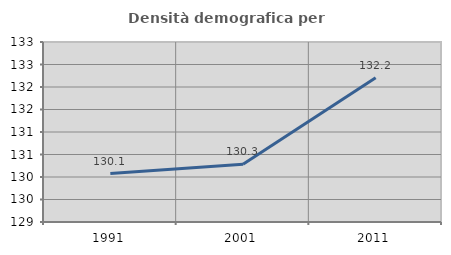
| Category | Densità demografica |
|---|---|
| 1991.0 | 130.076 |
| 2001.0 | 130.283 |
| 2011.0 | 132.207 |